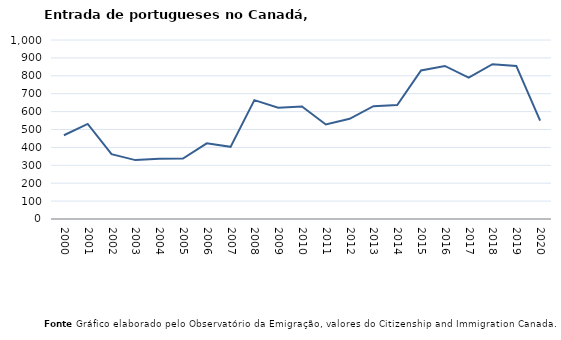
| Category | Entradas |
|---|---|
| 2000.0 | 468 |
| 2001.0 | 531 |
| 2002.0 | 362 |
| 2003.0 | 329 |
| 2004.0 | 336 |
| 2005.0 | 338 |
| 2006.0 | 423 |
| 2007.0 | 403 |
| 2008.0 | 664 |
| 2009.0 | 622 |
| 2010.0 | 629 |
| 2011.0 | 528 |
| 2012.0 | 560 |
| 2013.0 | 630 |
| 2014.0 | 637 |
| 2015.0 | 830 |
| 2016.0 | 855 |
| 2017.0 | 790 |
| 2018.0 | 865 |
| 2019.0 | 855 |
| 2020.0 | 550 |